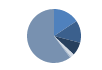
| Category | Series 0 |
|---|---|
| ARRASTRE | 194 |
| CERCO | 165 |
| PALANGRE | 99 |
| REDES DE ENMALLE | 25 |
| ARTES FIJAS | 10 |
| ARTES MENORES | 745 |